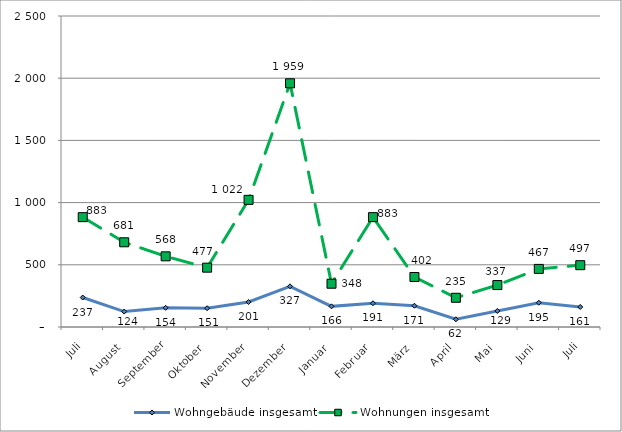
| Category | Wohngebäude insgesamt | Wohnungen insgesamt |
|---|---|---|
| Juli | 237 | 883 |
| August | 124 | 681 |
| September | 154 | 568 |
| Oktober | 151 | 477 |
| November | 201 | 1022 |
| Dezember | 327 | 1959 |
| Januar | 166 | 348 |
| Februar | 191 | 883 |
| März | 171 | 402 |
| April | 62 | 235 |
| Mai | 129 | 337 |
| Juni | 195 | 467 |
| Juli | 161 | 497 |